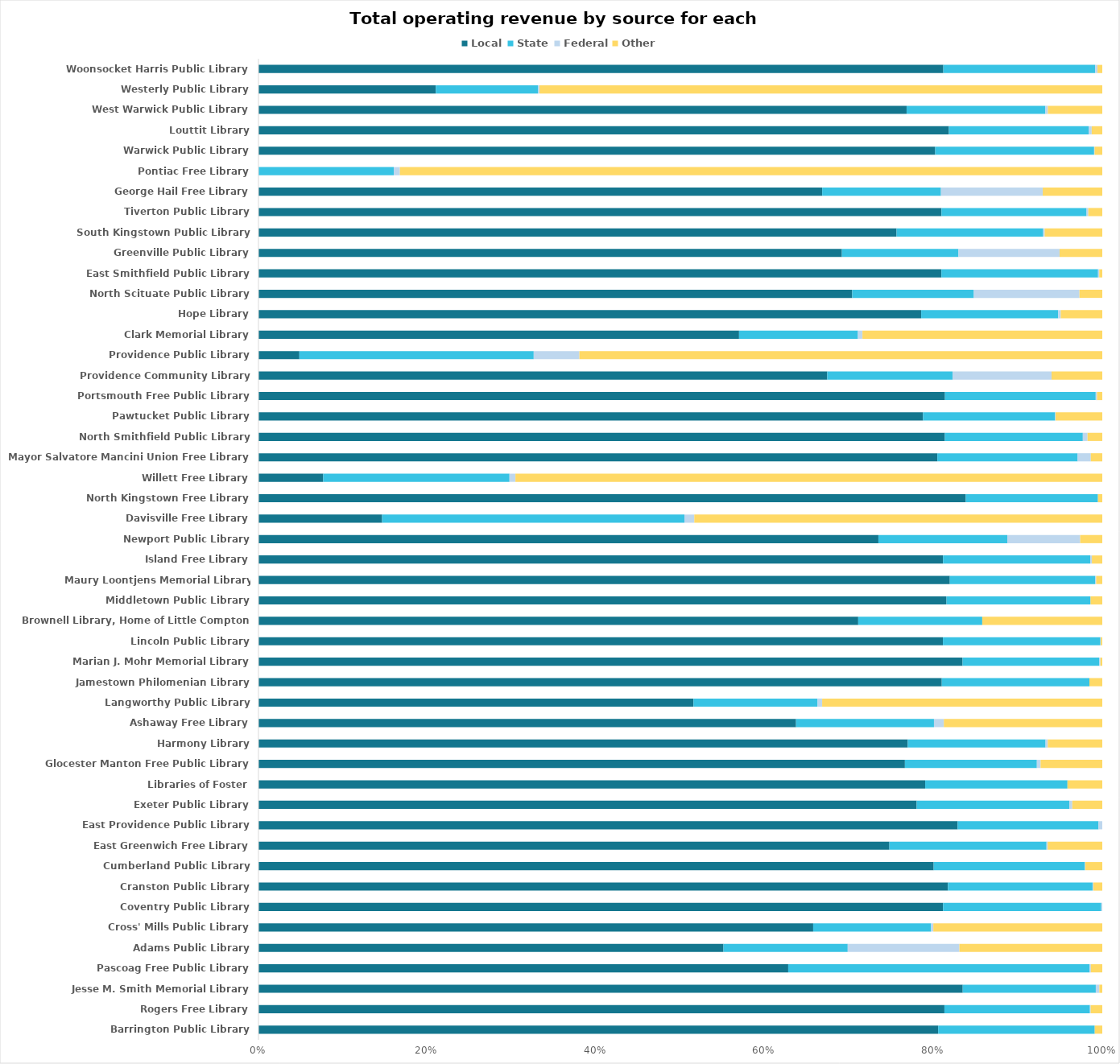
| Category | Local | State |  Federal  |  Other  |
|---|---|---|---|---|
| Barrington Public Library | 0.806 | 0.186 | 0 | 0.009 |
| Rogers Free Library | 0.813 | 0.172 | 0.001 | 0.014 |
| Jesse M. Smith Memorial Library | 0.835 | 0.158 | 0.004 | 0.003 |
| Pascoag Free Public Library | 0.628 | 0.357 | 0.002 | 0.014 |
| Adams Public Library | 0.551 | 0.147 | 0.132 | 0.169 |
| Cross' Mills Public Library | 0.657 | 0.14 | 0.003 | 0.2 |
| Coventry Public Library | 0.811 | 0.187 | 0.001 | 0 |
| Cranston Public Library | 0.817 | 0.171 | 0.001 | 0.011 |
| Cumberland Public Library | 0.8 | 0.179 | 0.001 | 0.02 |
| East Greenwich Free Library | 0.748 | 0.186 | 0.001 | 0.065 |
| East Providence Public Library | 0.829 | 0.167 | 0.004 | 0 |
| Exeter Public Library | 0.78 | 0.181 | 0.003 | 0.036 |
| Libraries of Foster | 0.79 | 0.169 | 0 | 0.041 |
| Glocester Manton Free Public Library | 0.766 | 0.156 | 0.004 | 0.073 |
| Harmony Library | 0.769 | 0.163 | 0.003 | 0.065 |
| Ashaway Free Library | 0.637 | 0.163 | 0.012 | 0.188 |
| Langworthy Public Library | 0.516 | 0.147 | 0.005 | 0.332 |
| Jamestown Philomenian Library | 0.81 | 0.175 | 0 | 0.015 |
| Marian J. Mohr Memorial Library | 0.834 | 0.162 | 0.001 | 0.002 |
| Lincoln Public Library | 0.811 | 0.187 | 0.001 | 0.002 |
| Brownell Library, Home of Little Compton | 0.711 | 0.147 | 0 | 0.142 |
| Middletown Public Library | 0.815 | 0.171 | 0 | 0.014 |
| Maury Loontjens Memorial Library (Narragansett) | 0.819 | 0.172 | 0.001 | 0.007 |
| Island Free Library | 0.811 | 0.174 | 0.002 | 0.012 |
| Newport Public Library | 0.735 | 0.153 | 0.086 | 0.026 |
| Davisville Free Library | 0.147 | 0.358 | 0.012 | 0.483 |
| North Kingstown Free Library | 0.838 | 0.157 | 0 | 0.005 |
| Willett Free Library | 0.077 | 0.221 | 0.007 | 0.695 |
| Mayor Salvatore Mancini Union Free Library | 0.805 | 0.166 | 0.016 | 0.014 |
| North Smithfield Public Library | 0.813 | 0.163 | 0.006 | 0.017 |
| Pawtucket Public Library | 0.788 | 0.156 | 0.001 | 0.055 |
| Portsmouth Free Public Library | 0.814 | 0.179 | 0.002 | 0.006 |
| Providence Community Library | 0.674 | 0.148 | 0.117 | 0.06 |
| Providence Public Library | 0.048 | 0.278 | 0.054 | 0.62 |
| Clark Memorial Library | 0.57 | 0.141 | 0.005 | 0.284 |
| Hope Library | 0.785 | 0.162 | 0.003 | 0.049 |
| North Scituate Public Library | 0.704 | 0.144 | 0.125 | 0.027 |
| East Smithfield Public Library | 0.809 | 0.186 | 0.001 | 0.004 |
| Greenville Public Library | 0.691 | 0.138 | 0.12 | 0.051 |
| South Kingstown Public Library | 0.756 | 0.174 | 0.002 | 0.068 |
| Tiverton Public Library | 0.809 | 0.172 | 0.002 | 0.017 |
| George Hail Free Library | 0.668 | 0.141 | 0.121 | 0.071 |
| Pontiac Free Library | 0 | 0.16 | 0.007 | 0.832 |
| Warwick Public Library | 0.802 | 0.188 | 0.001 | 0.009 |
| Louttit Library | 0.818 | 0.166 | 0.004 | 0.013 |
| West Warwick Public Library | 0.768 | 0.164 | 0.003 | 0.064 |
| Westerly Public Library | 0.21 | 0.121 | 0.002 | 0.667 |
| Woonsocket Harris Public Library | 0.812 | 0.18 | 0.003 | 0.006 |